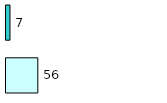
| Category | Series 0 | Series 1 |
|---|---|---|
| 0 | 56 | 7 |